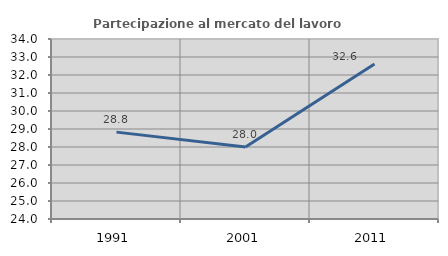
| Category | Partecipazione al mercato del lavoro  femminile |
|---|---|
| 1991.0 | 28.827 |
| 2001.0 | 28 |
| 2011.0 | 32.615 |